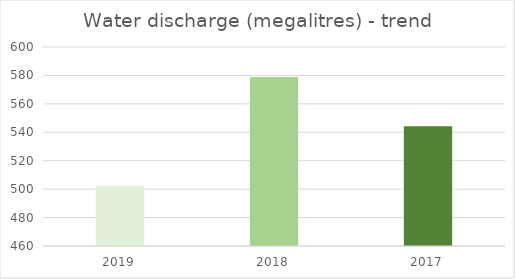
| Category | Series 0 |
|---|---|
| 0 | 502.45 |
| 1 | 578.86 |
| 2 | 544.16 |